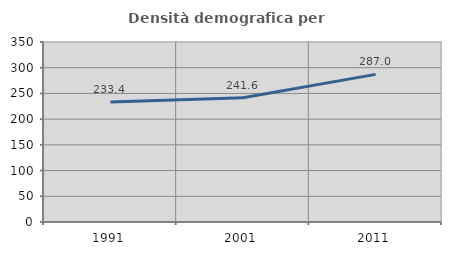
| Category | Densità demografica |
|---|---|
| 1991.0 | 233.378 |
| 2001.0 | 241.555 |
| 2011.0 | 287.015 |